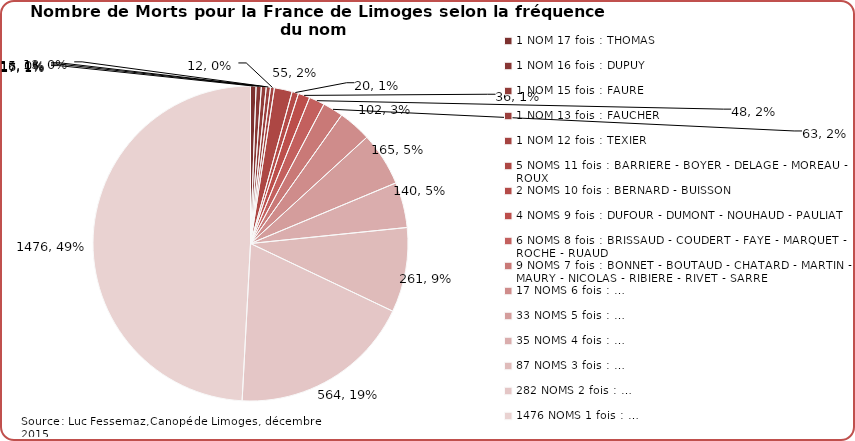
| Category | Nombre de Morts pour la France de Limoges selon la fréquence du nom (3306 Morts répartis entre 1978 NOMS) |
|---|---|
| 1 NOM 17 fois : THOMAS | 17 |
| 1 NOM 16 fois : DUPUY | 16 |
| 1 NOM 15 fois : FAURE | 15 |
| 1 NOM 13 fois : FAUCHER | 13 |
| 1 NOM 12 fois : TEXIER | 12 |
| 5 NOMS 11 fois : BARRIERE - BOYER - DELAGE - MOREAU - ROUX | 55 |
| 2 NOMS 10 fois : BERNARD - BUISSON | 20 |
| 4 NOMS 9 fois : DUFOUR - DUMONT - NOUHAUD - PAULIAT | 36 |
| 6 NOMS 8 fois : BRISSAUD - COUDERT - FAYE - MARQUET - ROCHE - RUAUD | 48 |
| 9 NOMS 7 fois : BONNET - BOUTAUD - CHATARD - MARTIN - MAURY - NICOLAS - RIBIERE - RIVET - SARRE | 63 |
| 17 NOMS 6 fois : … | 102 |
| 33 NOMS 5 fois : … | 165 |
| 35 NOMS 4 fois : … | 140 |
| 87 NOMS 3 fois : … | 261 |
| 282 NOMS 2 fois : … | 564 |
| 1476 NOMS 1 fois : … | 1476 |